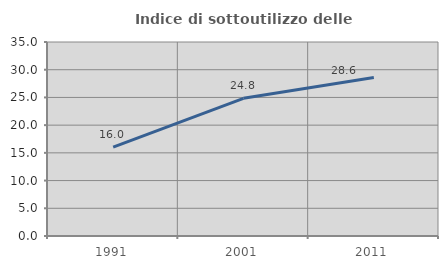
| Category | Indice di sottoutilizzo delle abitazioni  |
|---|---|
| 1991.0 | 16.036 |
| 2001.0 | 24.834 |
| 2011.0 | 28.609 |